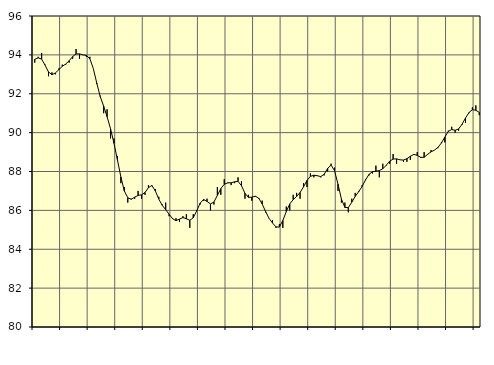
| Category | Piggar | Series 1 |
|---|---|---|
| nan | 93.6 | 93.77 |
| 87.0 | 93.9 | 93.85 |
| 87.0 | 94.1 | 93.78 |
| 87.0 | 93.5 | 93.47 |
| nan | 92.9 | 93.12 |
| 88.0 | 93.1 | 92.98 |
| 88.0 | 93 | 93.07 |
| 88.0 | 93.3 | 93.24 |
| nan | 93.5 | 93.41 |
| 89.0 | 93.5 | 93.53 |
| 89.0 | 93.6 | 93.7 |
| 89.0 | 93.8 | 93.91 |
| nan | 94.3 | 94.05 |
| 90.0 | 93.8 | 94.05 |
| 90.0 | 94 | 94 |
| 90.0 | 93.9 | 93.97 |
| nan | 93.9 | 93.8 |
| 91.0 | 93.3 | 93.3 |
| 91.0 | 92.5 | 92.55 |
| 91.0 | 91.9 | 91.86 |
| nan | 91 | 91.36 |
| 92.0 | 91.2 | 90.82 |
| 92.0 | 89.7 | 90.2 |
| 92.0 | 89.7 | 89.45 |
| nan | 88.8 | 88.6 |
| 93.0 | 87.4 | 87.72 |
| 93.0 | 87.2 | 87 |
| 93.0 | 86.4 | 86.65 |
| nan | 86.6 | 86.57 |
| 94.0 | 86.6 | 86.68 |
| 94.0 | 87 | 86.77 |
| 94.0 | 86.6 | 86.8 |
| nan | 86.8 | 86.92 |
| 95.0 | 87.3 | 87.17 |
| 95.0 | 87.3 | 87.28 |
| 95.0 | 87.1 | 87 |
| nan | 86.7 | 86.58 |
| 96.0 | 86.3 | 86.26 |
| 96.0 | 86.4 | 86.04 |
| 96.0 | 85.7 | 85.8 |
| nan | 85.6 | 85.57 |
| 97.0 | 85.6 | 85.47 |
| 97.0 | 85.4 | 85.55 |
| 97.0 | 85.7 | 85.63 |
| nan | 85.8 | 85.57 |
| 98.0 | 85.1 | 85.49 |
| 98.0 | 85.8 | 85.62 |
| 98.0 | 86 | 85.97 |
| nan | 86.3 | 86.37 |
| 99.0 | 86.5 | 86.56 |
| 99.0 | 86.6 | 86.46 |
| 99.0 | 86 | 86.33 |
| nan | 86.3 | 86.43 |
| 0.0 | 87.2 | 86.77 |
| 0.0 | 86.8 | 87.12 |
| 0.0 | 87.6 | 87.34 |
| nan | 87.4 | 87.42 |
| 1.0 | 87.3 | 87.42 |
| 1.0 | 87.4 | 87.47 |
| 1.0 | 87.7 | 87.49 |
| nan | 87.5 | 87.27 |
| 2.0 | 86.6 | 86.88 |
| 2.0 | 86.8 | 86.67 |
| 2.0 | 86.5 | 86.68 |
| nan | 86.7 | 86.73 |
| 3.0 | 86.6 | 86.63 |
| 3.0 | 86.5 | 86.33 |
| 3.0 | 85.9 | 85.94 |
| nan | 85.6 | 85.59 |
| 4.0 | 85.5 | 85.35 |
| 4.0 | 85.1 | 85.15 |
| 4.0 | 85.3 | 85.14 |
| nan | 85.1 | 85.48 |
| 5.0 | 86.2 | 85.94 |
| 5.0 | 86 | 86.33 |
| 5.0 | 86.8 | 86.55 |
| nan | 86.9 | 86.72 |
| 6.0 | 86.6 | 86.92 |
| 6.0 | 87.4 | 87.21 |
| 6.0 | 87.2 | 87.54 |
| nan | 87.9 | 87.75 |
| 7.0 | 87.7 | 87.81 |
| 7.0 | 87.8 | 87.78 |
| 7.0 | 87.7 | 87.74 |
| nan | 87.8 | 87.86 |
| 8.0 | 88 | 88.16 |
| 8.0 | 88.4 | 88.33 |
| 8.0 | 88.2 | 88.04 |
| nan | 87 | 87.35 |
| 9.0 | 86.4 | 86.58 |
| 9.0 | 86.4 | 86.15 |
| 9.0 | 85.9 | 86.14 |
| nan | 86.6 | 86.42 |
| 10.0 | 86.9 | 86.72 |
| 10.0 | 87 | 86.96 |
| 10.0 | 87.3 | 87.23 |
| nan | 87.6 | 87.57 |
| 11.0 | 87.8 | 87.85 |
| 11.0 | 87.9 | 87.99 |
| 11.0 | 88.3 | 88.01 |
| nan | 87.7 | 88.05 |
| 12.0 | 88.4 | 88.14 |
| 12.0 | 88.3 | 88.32 |
| 12.0 | 88.4 | 88.53 |
| nan | 88.9 | 88.64 |
| 13.0 | 88.4 | 88.65 |
| 13.0 | 88.6 | 88.6 |
| 13.0 | 88.5 | 88.59 |
| nan | 88.5 | 88.66 |
| 14.0 | 88.6 | 88.78 |
| 14.0 | 88.9 | 88.88 |
| 14.0 | 89 | 88.83 |
| nan | 88.7 | 88.73 |
| 15.0 | 89 | 88.73 |
| 15.0 | 88.9 | 88.88 |
| 15.0 | 89.1 | 89.01 |
| nan | 89.1 | 89.1 |
| 16.0 | 89.2 | 89.24 |
| 16.0 | 89.5 | 89.46 |
| 16.0 | 89.5 | 89.77 |
| nan | 90.1 | 90.06 |
| 17.0 | 90.3 | 90.16 |
| 17.0 | 90 | 90.12 |
| 17.0 | 90.1 | 90.19 |
| nan | 90.4 | 90.43 |
| 18.0 | 90.5 | 90.75 |
| 18.0 | 91 | 91.03 |
| 18.0 | 91.3 | 91.18 |
| nan | 91.4 | 91.15 |
| 19.0 | 90.9 | 91.04 |